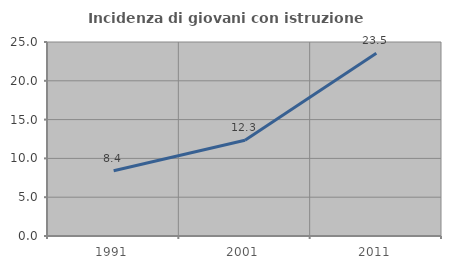
| Category | Incidenza di giovani con istruzione universitaria |
|---|---|
| 1991.0 | 8.404 |
| 2001.0 | 12.349 |
| 2011.0 | 23.546 |